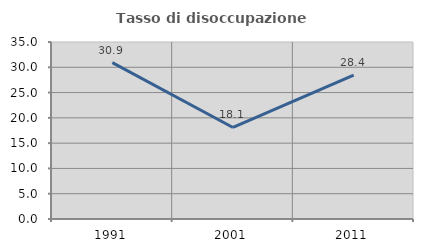
| Category | Tasso di disoccupazione giovanile  |
|---|---|
| 1991.0 | 30.911 |
| 2001.0 | 18.096 |
| 2011.0 | 28.431 |